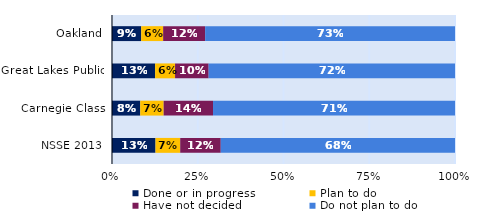
| Category | Done or in progress | Plan to do | Have not decided | Do not plan to do |
|---|---|---|---|---|
| Oakland | 0.085 | 0.064 | 0.122 | 0.728 |
| Great Lakes Public | 0.126 | 0.058 | 0.098 | 0.718 |
| Carnegie Class | 0.082 | 0.068 | 0.144 | 0.705 |
| NSSE 2013 | 0.127 | 0.072 | 0.118 | 0.683 |